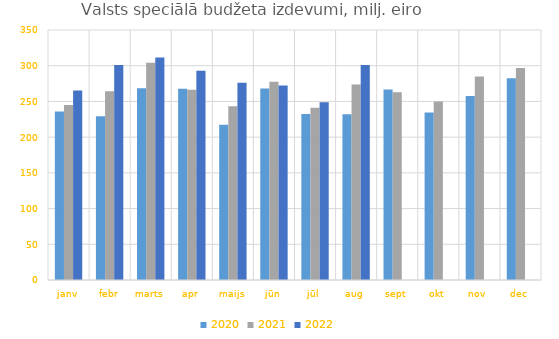
| Category | 2020 | 2021 | 2022 |
|---|---|---|---|
| janv | 235781.445 | 245021.603 | 265366.62 |
| febr | 229202.237 | 264114.802 | 301122.134 |
| marts | 268426.032 | 304192.595 | 311449.105 |
| apr | 267906.805 | 266305.843 | 292908.695 |
| maijs | 217225.441 | 243231.118 | 276006.043 |
| jūn | 268178.04 | 277705.46 | 272418.808 |
| jūl | 232397.631 | 241038.074 | 248833.143 |
| aug | 232000.053 | 273534.561 | 300867.01 |
| sept | 266855.812 | 262890.697 | 0 |
| okt | 234655.305 | 249947.821 | 0 |
| nov | 257570.365 | 284917.624 | 0 |
| dec | 282446.284 | 296686.983 | 0 |